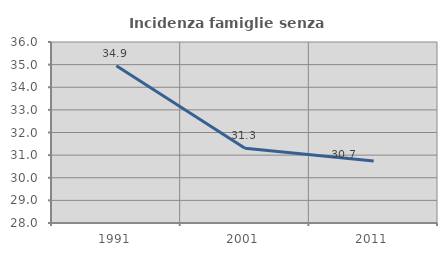
| Category | Incidenza famiglie senza nuclei |
|---|---|
| 1991.0 | 34.948 |
| 2001.0 | 31.3 |
| 2011.0 | 30.74 |